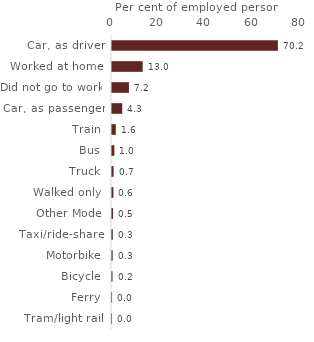
| Category | Series 0 |
|---|---|
| Car, as driver | 70.218 |
| Worked at home | 13 |
| Did not go to work | 7.177 |
| Car, as passenger | 4.336 |
| Train | 1.614 |
| Bus | 1.005 |
| Truck | 0.677 |
| Walked only | 0.609 |
| Other Mode | 0.458 |
| Taxi/ride-share | 0.341 |
| Motorbike | 0.294 |
| Bicycle | 0.212 |
| Ferry | 0.032 |
| Tram/light rail | 0.028 |